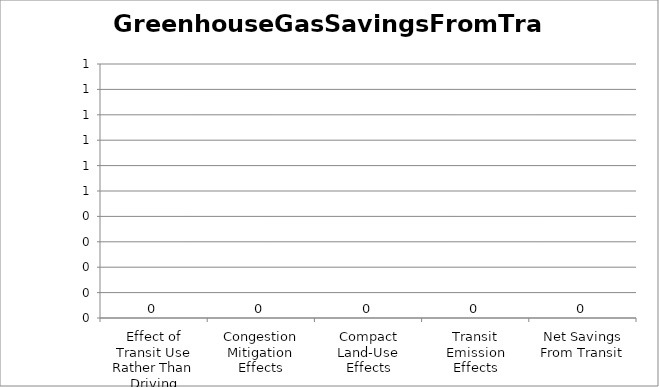
| Category | GreenhouseGasSavingsFromTransit |
|---|---|
| Effect of Transit Use Rather Than Driving | 0 |
| Congestion Mitigation Effects | 0 |
| Compact Land-Use Effects | 0 |
| Transit Emission Effects | 0 |
| Net Savings From Transit | 0 |